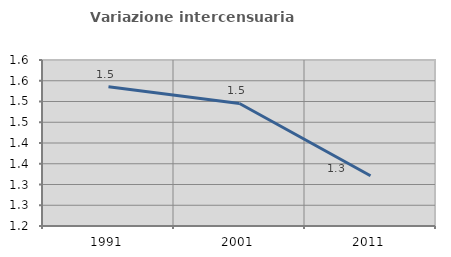
| Category | Variazione intercensuaria annua |
|---|---|
| 1991.0 | 1.535 |
| 2001.0 | 1.495 |
| 2011.0 | 1.321 |